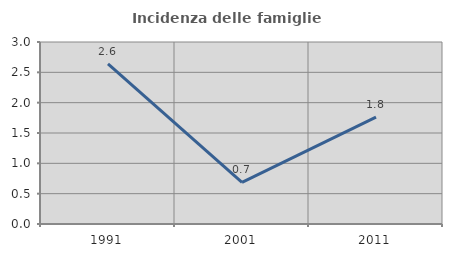
| Category | Incidenza delle famiglie numerose |
|---|---|
| 1991.0 | 2.638 |
| 2001.0 | 0.686 |
| 2011.0 | 1.763 |